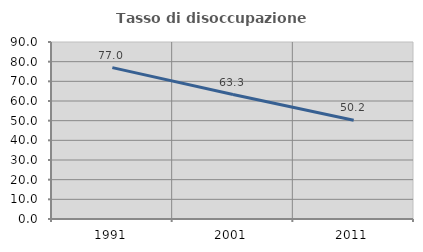
| Category | Tasso di disoccupazione giovanile  |
|---|---|
| 1991.0 | 76.969 |
| 2001.0 | 63.287 |
| 2011.0 | 50.247 |